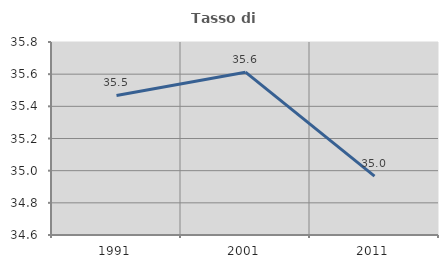
| Category | Tasso di occupazione   |
|---|---|
| 1991.0 | 35.468 |
| 2001.0 | 35.612 |
| 2011.0 | 34.966 |